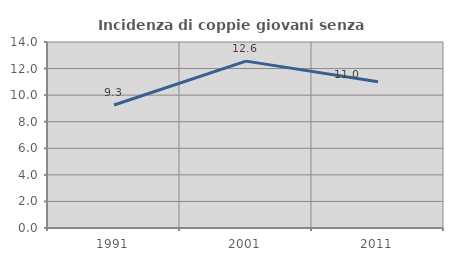
| Category | Incidenza di coppie giovani senza figli |
|---|---|
| 1991.0 | 9.259 |
| 2001.0 | 12.56 |
| 2011.0 | 11.014 |